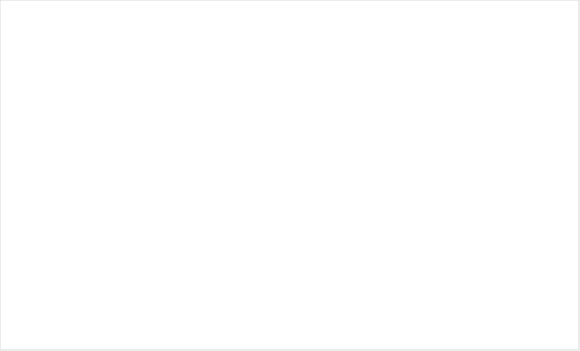
| Category | Итог |
|---|---|
| 7 | 1 |
| 8 | 6 |
| 9 | 2 |
| 10 | 7 |